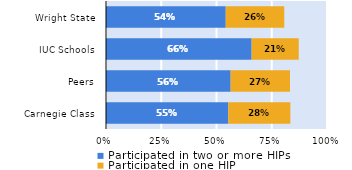
| Category | Participated in two or more HIPs | Participated in one HIP |
|---|---|---|
| Carnegie Class | 0.553 | 0.281 |
| Peers | 0.564 | 0.269 |
| IUC Schools | 0.659 | 0.213 |
| Wright State | 0.542 | 0.265 |